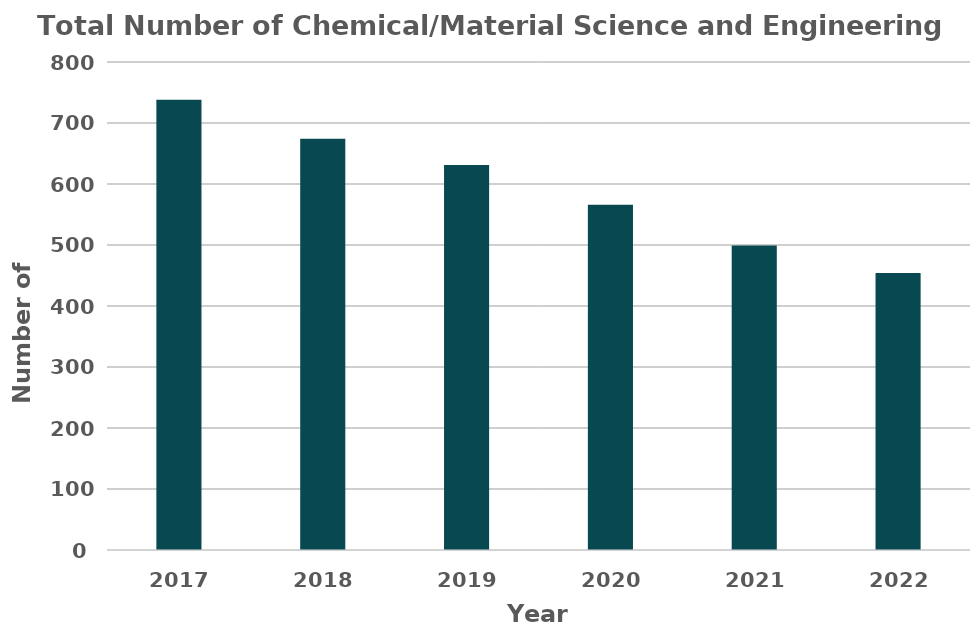
| Category | Total Number of Biosystems Engineering Students |
|---|---|
| 2017.0 | 738 |
| 2018.0 | 674 |
| 2019.0 | 631 |
| 2020.0 | 566 |
| 2021.0 | 499 |
| 2022.0 | 454 |